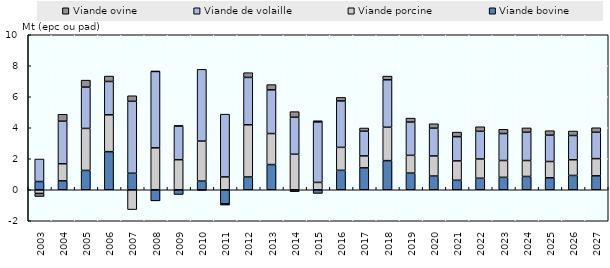
| Category | Viande bovine | Viande porcine | Viande de volaille | Viande ovine |
|---|---|---|---|---|
| 2003.0 | 0.531 | -0.238 | 1.452 | -0.198 |
| 2004.0 | 0.575 | 1.103 | 2.745 | 0.446 |
| 2005.0 | 1.247 | 2.709 | 2.665 | 0.451 |
| 2006.0 | 2.457 | 2.379 | 2.149 | 0.351 |
| 2007.0 | 1.065 | -1.28 | 4.642 | 0.358 |
| 2008.0 | -0.715 | 2.705 | 4.926 | 0.018 |
| 2009.0 | -0.303 | 1.939 | 2.168 | 0.038 |
| 2010.0 | 0.559 | 2.581 | 4.63 | -0.032 |
| 2011.0 | -0.904 | 0.827 | 4.052 | -0.082 |
| 2012.0 | 0.824 | 3.37 | 3.054 | 0.305 |
| 2013.0 | 1.626 | 2.001 | 2.818 | 0.339 |
| 2014.0 | -0.122 | 2.29 | 2.388 | 0.361 |
| 2015.0 | -0.236 | 0.474 | 3.9 | 0.079 |
| 2016.0 | 1.253 | 1.482 | 2.996 | 0.229 |
| 2017.0 | 1.413 | 0.771 | 1.592 | 0.209 |
| 2018.0 | 1.879 | 2.154 | 3.062 | 0.24 |
| 2019.0 | 1.074 | 1.147 | 2.145 | 0.256 |
| 2020.0 | 0.885 | 1.296 | 1.792 | 0.285 |
| 2021.0 | 0.612 | 1.25 | 1.563 | 0.295 |
| 2022.0 | 0.742 | 1.243 | 1.786 | 0.294 |
| 2023.0 | 0.801 | 1.087 | 1.738 | 0.275 |
| 2024.0 | 0.858 | 1.028 | 1.824 | 0.282 |
| 2025.0 | 0.774 | 1.049 | 1.7 | 0.289 |
| 2026.0 | 0.923 | 1.012 | 1.563 | 0.291 |
| 2027.0 | 0.898 | 1.11 | 1.701 | 0.292 |